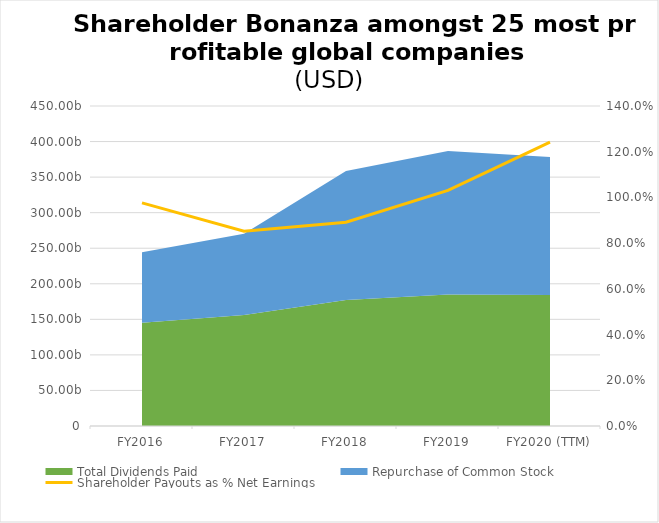
| Category | Shareholder Payouts as % Net Earnings |
|---|---|
| 0 | 0.976 |
| 1 | 0.852 |
| 2 | 0.891 |
| 3 | 1.03 |
| 4 | 1.242 |